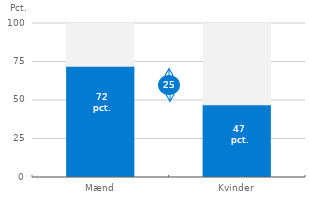
| Category | Series 0 | Series 1 |
|---|---|---|
| Mænd | 72.283 | 27.717 |
| Kvinder | 47.264 | 52.736 |